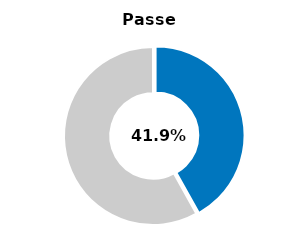
| Category | Series 0 |
|---|---|
| Passed | 0.419 |
| Other | 0.581 |